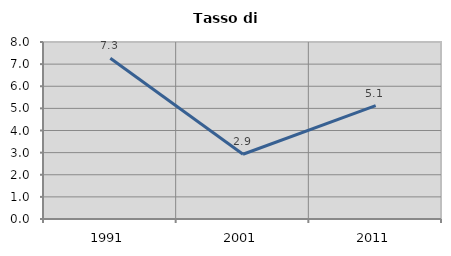
| Category | Tasso di disoccupazione   |
|---|---|
| 1991.0 | 7.262 |
| 2001.0 | 2.925 |
| 2011.0 | 5.122 |